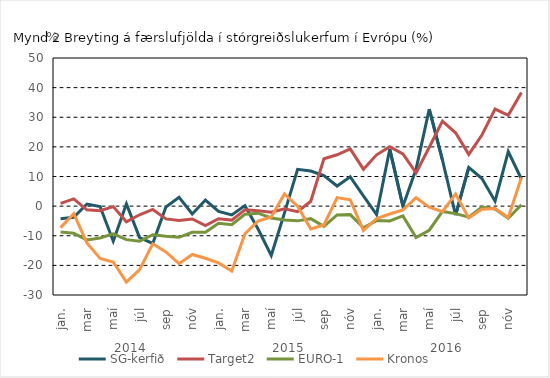
| Category | SG-kerfið | Target2 | EURO-1 | Kronos |
|---|---|---|---|---|
| 0 | -4.277 | 0.908 | -8.74 | -7.259 |
| 1 | -3.779 | 2.438 | -9.177 | -2.528 |
| 2 | 0.707 | -1.243 | -11.399 | -12.437 |
| 3 | -0.141 | -1.575 | -10.732 | -17.69 |
| 4 | -11.833 | -0.167 | -9.349 | -18.839 |
| 5 | 0.769 | -5.297 | -11.319 | -25.641 |
| 6 | -10.597 | -2.917 | -11.848 | -21.457 |
| 7 | -12.609 | -1.121 | -9.634 | -12.727 |
| 8 | -0.286 | -4.312 | -10.156 | -15.436 |
| 9 | 2.962 | -4.831 | -10.536 | -19.425 |
| 10 | -2.652 | -4.331 | -8.812 | -16.324 |
| 11 | 2.043 | -6.576 | -8.855 | -17.601 |
| 12 | -1.79 | -4.261 | -5.785 | -19.163 |
| 13 | -2.956 | -4.715 | -6.279 | -21.92 |
| 14 | 0.162 | -1.212 | -2.743 | -9.326 |
| 15 | -7.731 | -1.563 | -2.379 | -5.075 |
| 16 | -16.648 | -2.078 | -3.99 | -3.657 |
| 17 | -2.351 | -0.881 | -4.692 | 4.105 |
| 18 | 12.418 | -1.897 | -4.973 | 0 |
| 19 | 11.833 | 1.631 | -4.238 | -7.692 |
| 20 | 10.3 | 15.999 | -6.815 | -6.349 |
| 21 | 6.778 | 17.338 | -2.961 | 2.886 |
| 22 | 9.876 | 19.321 | -2.872 | 2.131 |
| 23 | 3.438 | 12.467 | -7.305 | -8.228 |
| 24 | -2.83 | 17.311 | -4.891 | -4.174 |
| 25 | 19.22 | 20.086 | -4.979 | -2.658 |
| 26 | -0.013 | 17.591 | -3.3 | -1.266 |
| 27 | 12.538 | 11.242 | -10.577 | 2.83 |
| 28 | 32.732 | 19.862 | -8.137 | -0.33 |
| 29 | 15.598 | 28.699 | -1.799 | -1.893 |
| 30 | -3.007 | 24.751 | -2.535 | 4.124 |
| 31 | 13.094 | 17.466 | -3.741 | -3.993 |
| 32 | 9.295 | 23.997 | -0.326 | -1.017 |
| 33 | 1.653 | 32.763 | -0.958 | -0.825 |
| 34 | 18.441 | 30.636 | -4.108 | -3.852 |
| 35 | 9.152 | 38.386 | 0.477 | 9.655 |